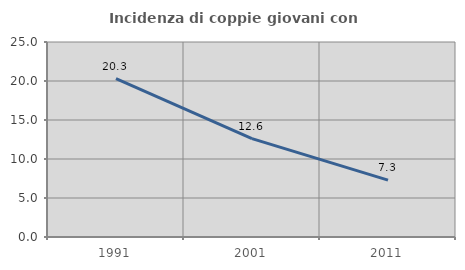
| Category | Incidenza di coppie giovani con figli |
|---|---|
| 1991.0 | 20.317 |
| 2001.0 | 12.605 |
| 2011.0 | 7.284 |